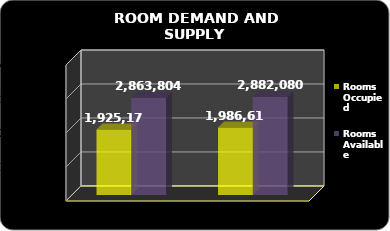
| Category | Rooms Occupied | Rooms Available |
|---|---|---|
| 2016.0 | 1986612 | 2882080 |
| 2015.0 | 1925179 | 2863804 |